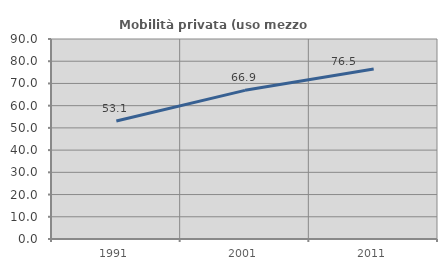
| Category | Mobilità privata (uso mezzo privato) |
|---|---|
| 1991.0 | 53.097 |
| 2001.0 | 66.897 |
| 2011.0 | 76.503 |